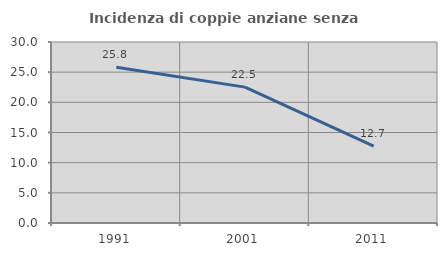
| Category | Incidenza di coppie anziane senza figli  |
|---|---|
| 1991.0 | 25.806 |
| 2001.0 | 22.523 |
| 2011.0 | 12.745 |